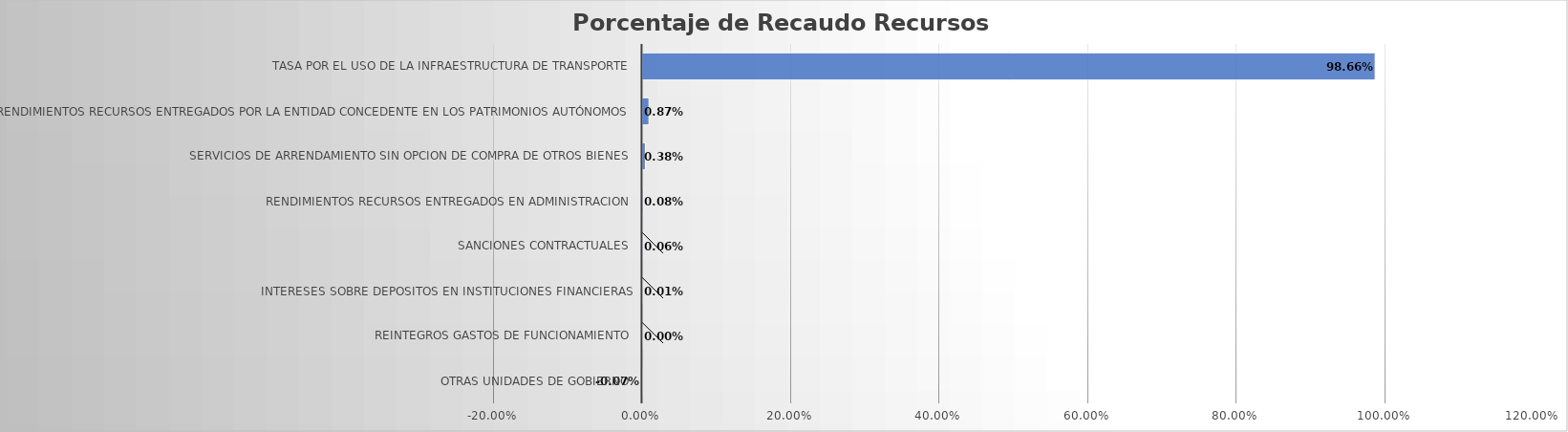
| Category | Total |
|---|---|
| OTRAS UNIDADES DE GOBIERNO | -0.001 |
| REINTEGROS GASTOS DE FUNCIONAMIENTO | 0 |
| INTERESES SOBRE DEPOSITOS EN INSTITUCIONES FINANCIERAS | 0 |
| SANCIONES CONTRACTUALES | 0.001 |
| RENDIMIENTOS RECURSOS ENTREGADOS EN ADMINISTRACION | 0.001 |
| SERVICIOS DE ARRENDAMIENTO SIN OPCION DE COMPRA DE OTROS BIENES | 0.004 |
| RENDIMIENTOS RECURSOS ENTREGADOS POR LA ENTIDAD CONCEDENTE EN LOS PATRIMONIOS AUTÓNOMOS | 0.009 |
| TASA POR EL USO DE LA INFRAESTRUCTURA DE TRANSPORTE | 0.987 |